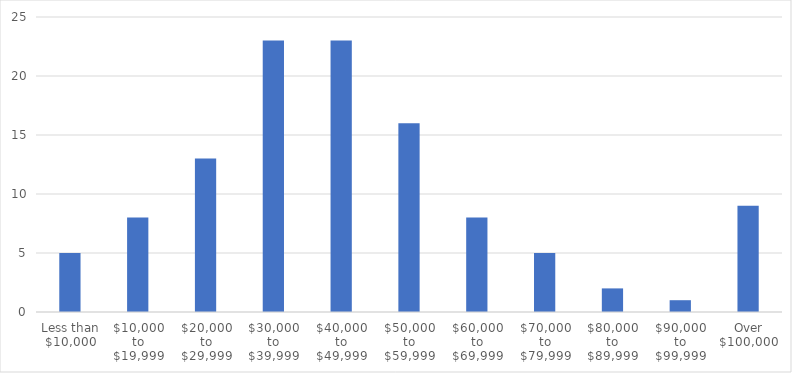
| Category | Number of Responses |
|---|---|
| Less than $10,000 | 5 |
| $10,000 to $19,999 | 8 |
| $20,000 to $29,999 | 13 |
| $30,000 to $39,999 | 23 |
| $40,000 to $49,999 | 23 |
| $50,000 to $59,999 | 16 |
| $60,000 to $69,999 | 8 |
| $70,000 to $79,999 | 5 |
| $80,000 to $89,999 | 2 |
| $90,000 to $99,999 | 1 |
| Over $100,000 | 9 |